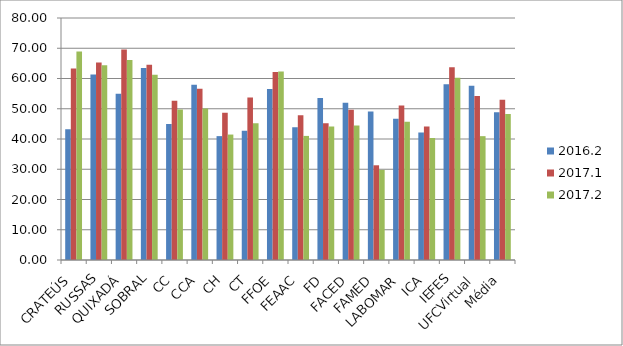
| Category | 2016.2 | 2017.1 | 2017.2 |
|---|---|---|---|
| CRATEÚS | 43.23 | 63.33 | 68.95 |
| RUSSAS | 61.31 | 65.33 | 64.39 |
| QUIXADÁ | 54.95 | 69.6 | 66.09 |
| SOBRAL | 63.5 | 64.53 | 61.2 |
| CC | 44.95 | 52.63 | 49.72 |
| CCA | 57.91 | 56.62 | 50.06 |
| CH | 40.95 | 48.68 | 41.47 |
| CT | 42.75 | 53.7 | 45.21 |
| FFOE | 56.56 | 62.19 | 62.34 |
| FEAAC | 43.87 | 47.82 | 41.02 |
| FD | 53.56 | 45.21 | 44.1 |
| FACED | 51.95 | 49.63 | 44.44 |
| FAMED | 49.12 | 31.31 | 29.79 |
| LABOMAR | 46.72 | 51.06 | 45.71 |
| ICA | 42.15 | 44.11 | 40.34 |
| IEFES | 58.12 | 63.69 | 60.22 |
| UFCVirtual | 57.58 | 54.18 | 40.94 |
| Média | 48.81 | 52.97 | 48.29 |